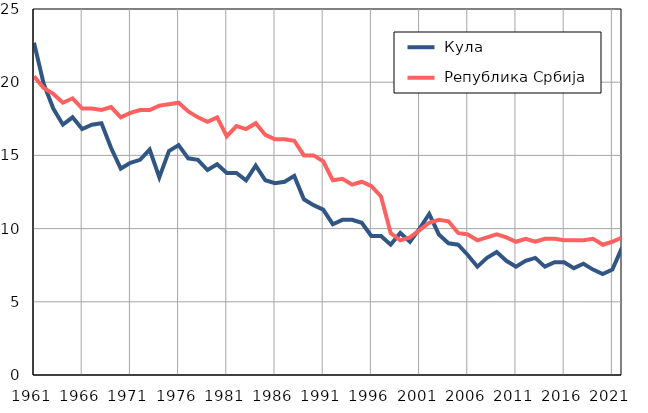
| Category |  Кула |  Република Србија |
|---|---|---|
| 1961.0 | 22.7 | 20.4 |
| 1962.0 | 19.9 | 19.6 |
| 1963.0 | 18.2 | 19.2 |
| 1964.0 | 17.1 | 18.6 |
| 1965.0 | 17.6 | 18.9 |
| 1966.0 | 16.8 | 18.2 |
| 1967.0 | 17.1 | 18.2 |
| 1968.0 | 17.2 | 18.1 |
| 1969.0 | 15.5 | 18.3 |
| 1970.0 | 14.1 | 17.6 |
| 1971.0 | 14.5 | 17.9 |
| 1972.0 | 14.7 | 18.1 |
| 1973.0 | 15.4 | 18.1 |
| 1974.0 | 13.5 | 18.4 |
| 1975.0 | 15.3 | 18.5 |
| 1976.0 | 15.7 | 18.6 |
| 1977.0 | 14.8 | 18 |
| 1978.0 | 14.7 | 17.6 |
| 1979.0 | 14 | 17.3 |
| 1980.0 | 14.4 | 17.6 |
| 1981.0 | 13.8 | 16.3 |
| 1982.0 | 13.8 | 17 |
| 1983.0 | 13.3 | 16.8 |
| 1984.0 | 14.3 | 17.2 |
| 1985.0 | 13.3 | 16.4 |
| 1986.0 | 13.1 | 16.1 |
| 1987.0 | 13.2 | 16.1 |
| 1988.0 | 13.6 | 16 |
| 1989.0 | 12 | 15 |
| 1990.0 | 11.6 | 15 |
| 1991.0 | 11.3 | 14.6 |
| 1992.0 | 10.3 | 13.3 |
| 1993.0 | 10.6 | 13.4 |
| 1994.0 | 10.6 | 13 |
| 1995.0 | 10.4 | 13.2 |
| 1996.0 | 9.5 | 12.9 |
| 1997.0 | 9.5 | 12.2 |
| 1998.0 | 8.9 | 9.7 |
| 1999.0 | 9.7 | 9.2 |
| 2000.0 | 9.1 | 9.4 |
| 2001.0 | 10 | 9.9 |
| 2002.0 | 11 | 10.4 |
| 2003.0 | 9.6 | 10.6 |
| 2004.0 | 9 | 10.5 |
| 2005.0 | 8.9 | 9.7 |
| 2006.0 | 8.2 | 9.6 |
| 2007.0 | 7.4 | 9.2 |
| 2008.0 | 8 | 9.4 |
| 2009.0 | 8.4 | 9.6 |
| 2010.0 | 7.8 | 9.4 |
| 2011.0 | 7.4 | 9.1 |
| 2012.0 | 7.8 | 9.3 |
| 2013.0 | 8 | 9.1 |
| 2014.0 | 7.4 | 9.3 |
| 2015.0 | 7.7 | 9.3 |
| 2016.0 | 7.7 | 9.2 |
| 2017.0 | 7.3 | 9.2 |
| 2018.0 | 7.6 | 9.2 |
| 2019.0 | 7.2 | 9.3 |
| 2020.0 | 6.9 | 8.9 |
| 2021.0 | 7.2 | 9.1 |
| 2022.0 | 8.7 | 9.4 |